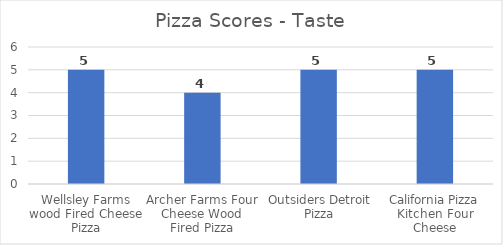
| Category | Series 0 |
|---|---|
| Wellsley Farms wood Fired Cheese Pizza | 5 |
| Archer Farms Four Cheese Wood Fired Pizza | 4 |
| Outsiders Detroit Pizza | 5 |
| California Pizza Kitchen Four Cheese | 5 |